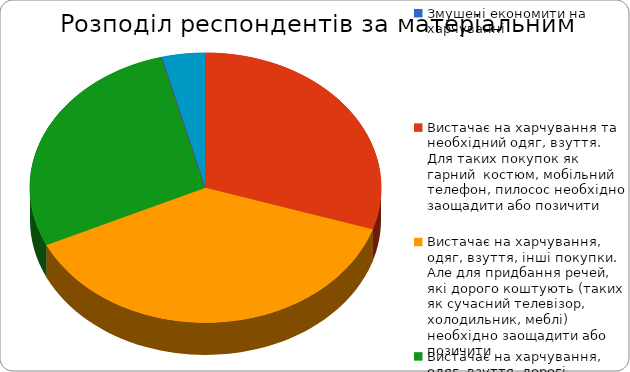
| Category | Series 0 |
|---|---|
| Змушені економити на харчуванні | 0 |
| Вистачає на харчування та необхідний одяг, взуття. Для таких покупок як гарний  костюм, мобільний телефон, пилосос необхідно заощадити або позичити | 15 |
| Вистачає на харчування, одяг, взуття, інші покупки. Але для придбання речей, які дорого коштують (таких як сучасний телевізор, холодильник, меблі) необхідно заощадити або позичити | 19 |
| Вистачає на харчування, одяг, взуття, дорогі покупки. Для таких покупок як машина, квартира необхідно заощадити або позичити | 14 |
| Будь-які необхідні покупки можу зробити в будь-який час | 0 |
| Не відповіли | 2 |